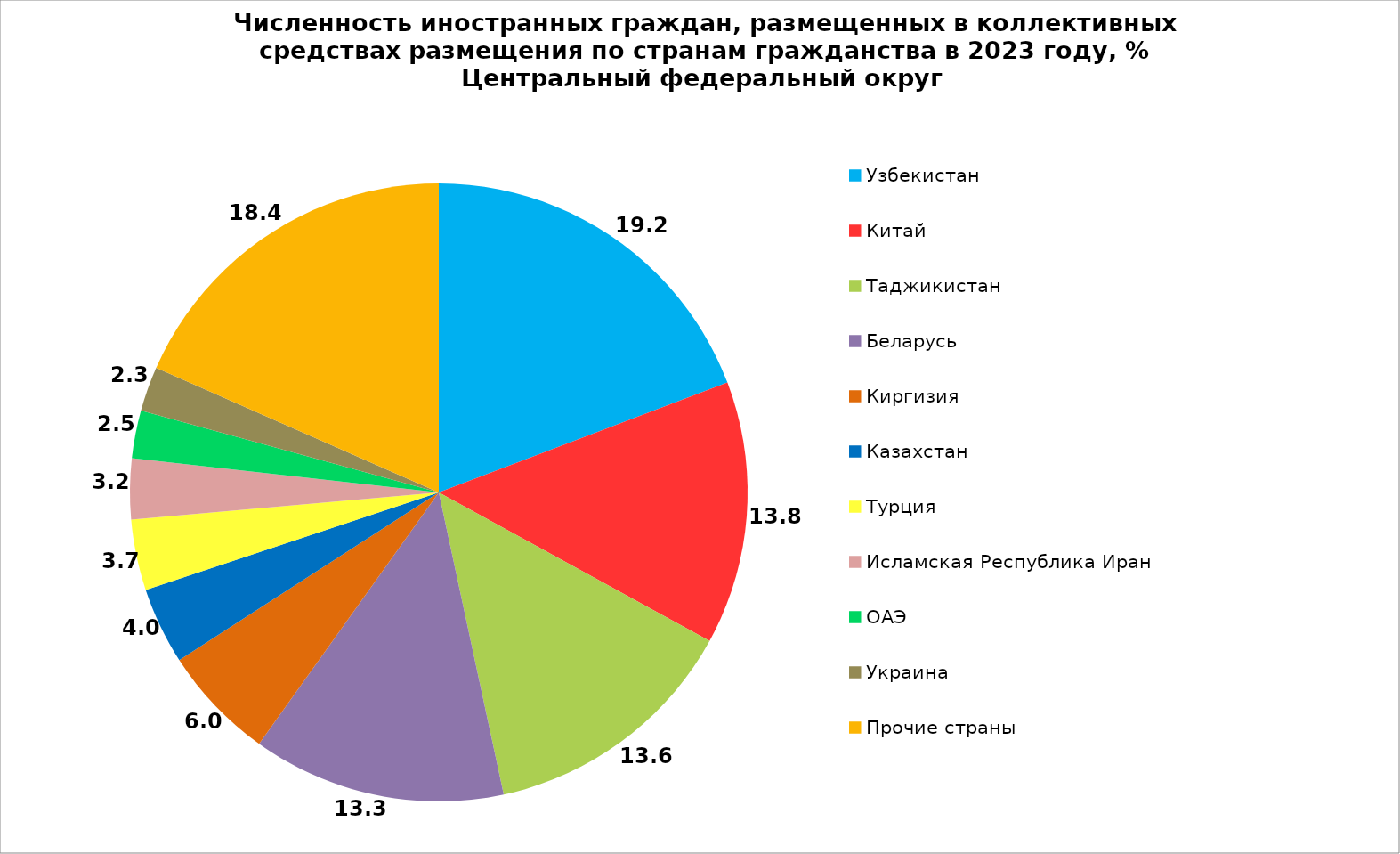
| Category | Series 0 |
|---|---|
| Узбекистан | 19.214 |
| Китай | 13.77 |
| Таджикистан | 13.643 |
| Беларусь | 13.255 |
| Киргизия | 5.998 |
| Казахстан | 4.015 |
| Турция | 3.704 |
| Исламская Республика Иран | 3.166 |
| ОАЭ | 2.5 |
| Украина | 2.341 |
| Прочие страны | 18.394 |